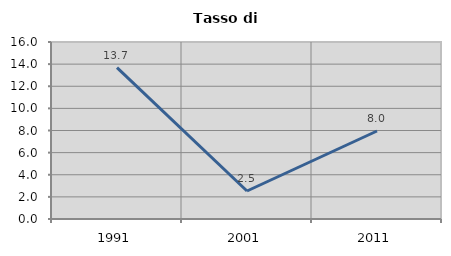
| Category | Tasso di disoccupazione   |
|---|---|
| 1991.0 | 13.684 |
| 2001.0 | 2.532 |
| 2011.0 | 7.955 |